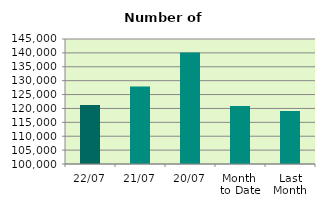
| Category | Series 0 |
|---|---|
| 22/07 | 121254 |
| 21/07 | 127878 |
| 20/07 | 140154 |
| Month 
to Date | 120849.125 |
| Last
Month | 119107.818 |